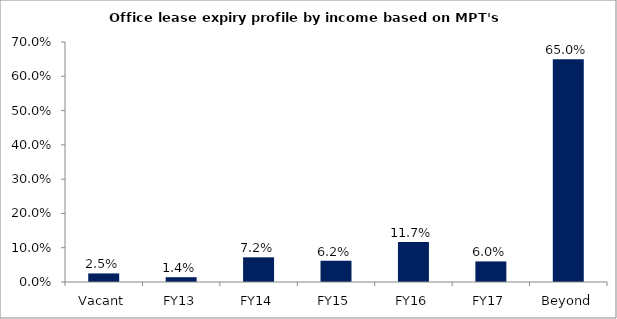
| Category | Series 0 |
|---|---|
| Vacant | 0.025 |
| FY13 | 0.014 |
| FY14 | 0.072 |
| FY15 | 0.062 |
| FY16 | 0.117 |
| FY17 | 0.06 |
| Beyond | 0.65 |